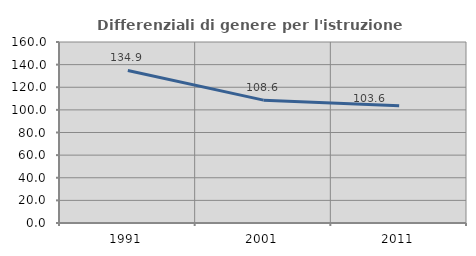
| Category | Differenziali di genere per l'istruzione superiore |
|---|---|
| 1991.0 | 134.881 |
| 2001.0 | 108.604 |
| 2011.0 | 103.555 |